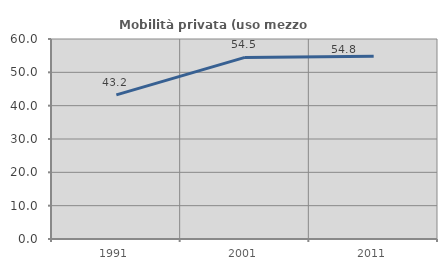
| Category | Mobilità privata (uso mezzo privato) |
|---|---|
| 1991.0 | 43.243 |
| 2001.0 | 54.483 |
| 2011.0 | 54.808 |